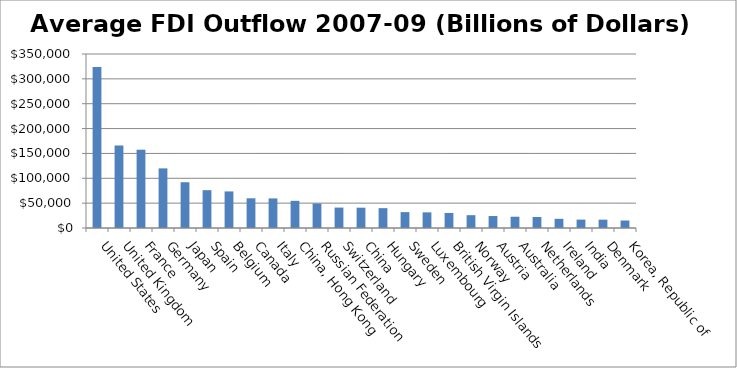
| Category | FDI 07-09 |
|---|---|
|  United States | 324027.667 |
|  United Kingdom | 165974.201 |
|  France | 157513.955 |
|  Germany | 119929.61 |
|  Japan | 92088.722 |
|  Spain | 76080.768 |
|  Belgium | 73600.214 |
|  Canada | 59755.458 |
|  Italy | 59511.601 |
|  China, Hong Kong | 54643.393 |
|  Russian Federation | 49354.539 |
|  Switzerland | 41078.458 |
|  China | 40872.953 |
|  Hungary | 39905.128 |
|  Sweden | 31907.905 |
|  Luxembourg | 31498.854 |
|  British Virgin Islands | 30241.011 |
|  Norway | 25785.172 |
|  Austria | 24063.055 |
|  Australia | 22688.922 |
|  Netherlands | 22082.611 |
|  Ireland | 18465.854 |
|  India | 16876.152 |
|  Denmark | 16755.011 |
|  Korea, Republic of | 15045.233 |